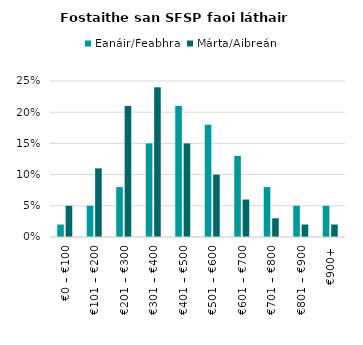
| Category | Eanáir/Feabhra | Márta/Aibreán |
|---|---|---|
| €0 – €100 | 0.02 | 0.05 |
| €101 – €200 | 0.05 | 0.11 |
| €201 – €300 | 0.08 | 0.21 |
| €301 – €400 | 0.15 | 0.24 |
| €401 – €500 | 0.21 | 0.15 |
| €501 – €600 | 0.18 | 0.1 |
| €601 – €700 | 0.13 | 0.06 |
| €701 – €800 | 0.08 | 0.03 |
| €801 – €900 | 0.05 | 0.02 |
| €900+ | 0.05 | 0.02 |